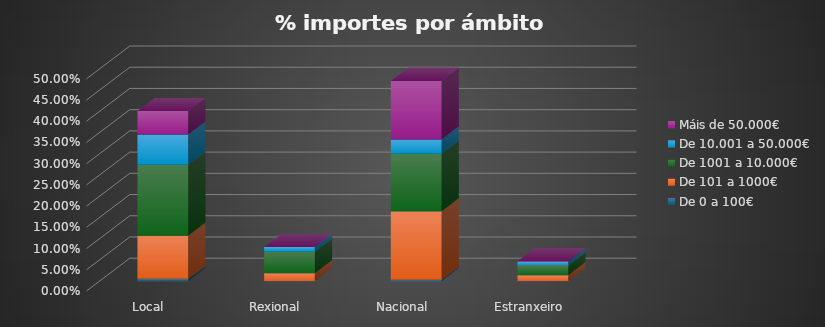
| Category | De 0 a 100€ | De 101 a 1000€ | De 1001 a 10.000€ | De 10.001 a 50.000€ | Máis de 50.000€ |
|---|---|---|---|---|---|
| Local | 0.005 | 0.102 | 0.167 | 0.071 | 0.055 |
| Rexional | 0.001 | 0.018 | 0.051 | 0.011 | 0 |
| Nacional | 0.003 | 0.161 | 0.136 | 0.033 | 0.138 |
| Estranxeiro | 0 | 0.013 | 0.023 | 0.008 | 0.002 |